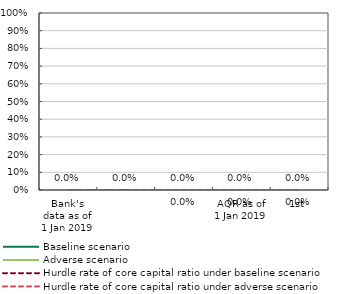
| Category | Baseline scenario | Adverse scenario | Hurdle rate of core capital ratio under baseline scenario | Hurdle rate of core capital ratio under adverse scenario |
|---|---|---|---|---|
| Bank's data as of 1 Jan 2019 | 0 | 0 | 0 | 0 |
| AQR as of 1 Jan 2019 | 0 | 0 | 0 | 0 |
| 1st | 0 | 0 | 0 | 0 |
| 2nd | 0 | 0 | 0 | 0 |
| 3rd | 0 | 0 | 0 | 0 |